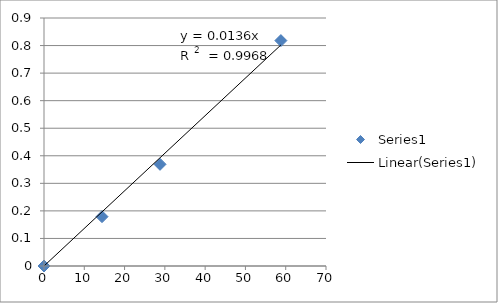
| Category | Series 0 |
|---|---|
| 0.0 | 0 |
| 14.4 | 0.179 |
| 28.8 | 0.369 |
| 58.8 | 0.818 |